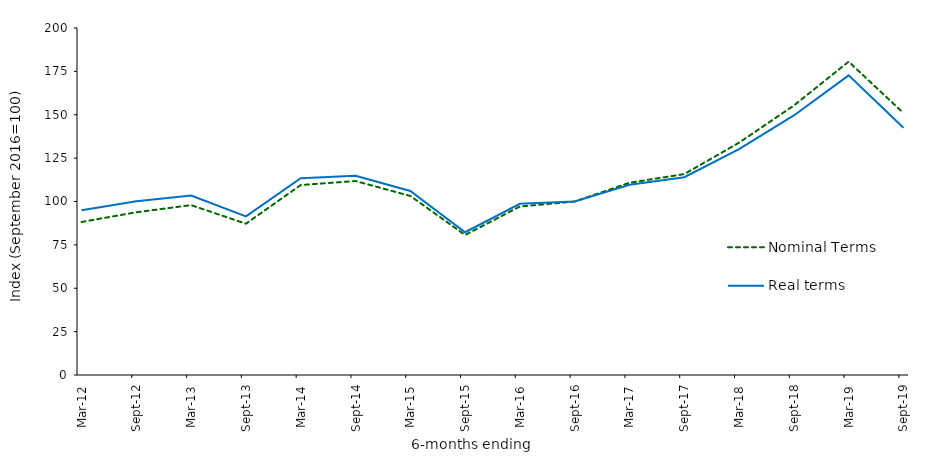
| Category | Nominal Terms | Real terms |
|---|---|---|
| 2012-03-31 | 88.2 | 95 |
| 2012-09-30 | 93.8 | 100.1 |
| 2013-03-31 | 97.9 | 103.4 |
| 2013-09-30 | 87.2 | 91.4 |
| 2014-03-31 | 109.5 | 113.4 |
| 2014-09-30 | 111.8 | 114.8 |
| 2015-03-31 | 103.2 | 106.1 |
| 2015-09-30 | 80.7 | 82.3 |
| 2016-03-31 | 97.1 | 98.7 |
| 2016-09-30 | 100 | 100 |
| 2017-03-31 | 110.8 | 109.6 |
| 2017-09-30 | 115.8 | 114 |
| 2018-03-31 | 133.9 | 130.2 |
| 2018-09-30 | 155.3 | 149.6 |
| 2019-03-31 | 180.6 | 172.7 |
| 2019-09-30 | 151 | 142.5 |